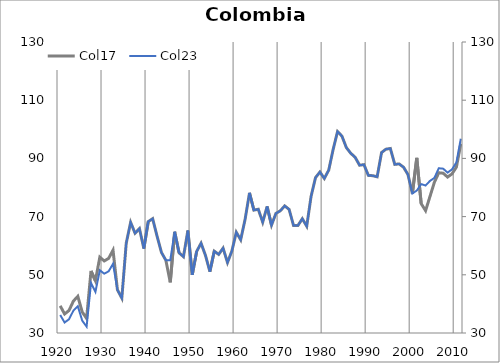
| Category | Col17 |
|---|---|
| 1920.0 | 39.337 |
| 1921.0 | 36.531 |
| 1922.0 | 37.738 |
| 1923.0 | 40.972 |
| 1924.0 | 42.599 |
| 1925.0 | 37.227 |
| 1926.0 | 34.996 |
| 1927.0 | 51.331 |
| 1928.0 | 47.96 |
| 1929.0 | 56.058 |
| 1930.0 | 54.765 |
| 1931.0 | 55.639 |
| 1932.0 | 58.459 |
| 1933.0 | 44.843 |
| 1934.0 | 41.987 |
| 1935.0 | 60.863 |
| 1936.0 | 68.028 |
| 1937.0 | 64.291 |
| 1938.0 | 65.883 |
| 1939.0 | 59.042 |
| 1940.0 | 68.3 |
| 1941.0 | 69.276 |
| 1942.0 | 63.308 |
| 1943.0 | 57.673 |
| 1944.0 | 55.026 |
| 1945.0 | 47.415 |
| 1946.0 | 64.778 |
| 1947.0 | 57.563 |
| 1948.0 | 56.226 |
| 1949.0 | 65.192 |
| 1950.0 | 50.018 |
| 1951.0 | 58.035 |
| 1952.0 | 60.857 |
| 1953.0 | 56.673 |
| 1954.0 | 51.092 |
| 1955.0 | 58.118 |
| 1956.0 | 57.011 |
| 1957.0 | 59.164 |
| 1958.0 | 54.214 |
| 1959.0 | 58.181 |
| 1960.0 | 64.62 |
| 1961.0 | 62.031 |
| 1962.0 | 69.062 |
| 1963.0 | 78.153 |
| 1964.0 | 72.23 |
| 1965.0 | 72.523 |
| 1966.0 | 68.073 |
| 1967.0 | 73.458 |
| 1968.0 | 67.061 |
| 1969.0 | 71.095 |
| 1970.0 | 72.002 |
| 1971.0 | 73.68 |
| 1972.0 | 72.471 |
| 1973.0 | 66.958 |
| 1974.0 | 66.934 |
| 1975.0 | 69.271 |
| 1976.0 | 66.703 |
| 1977.0 | 77.034 |
| 1978.0 | 83.399 |
| 1979.0 | 85.325 |
| 1980.0 | 83.106 |
| 1981.0 | 85.98 |
| 1982.0 | 93.07 |
| 1983.0 | 99.237 |
| 1984.0 | 97.661 |
| 1985.0 | 93.716 |
| 1986.0 | 91.768 |
| 1987.0 | 90.39 |
| 1988.0 | 87.656 |
| 1989.0 | 87.856 |
| 1990.0 | 84.158 |
| 1991.0 | 84.055 |
| 1992.0 | 83.678 |
| 1993.0 | 92.011 |
| 1994.0 | 93.181 |
| 1995.0 | 93.404 |
| 1996.0 | 87.946 |
| 1997.0 | 88.105 |
| 1998.0 | 86.972 |
| 1999.0 | 84.431 |
| 2000.0 | 77.936 |
| 2001.0 | 90.188 |
| 2002.0 | 74.467 |
| 2003.0 | 72.048 |
| 2004.0 | 76.924 |
| 2005.0 | 81.801 |
| 2006.0 | 85.066 |
| 2007.0 | 84.911 |
| 2008.0 | 83.589 |
| 2009.0 | 84.678 |
| 2010.0 | 87.01 |
| 2011.0 | 95.019 |